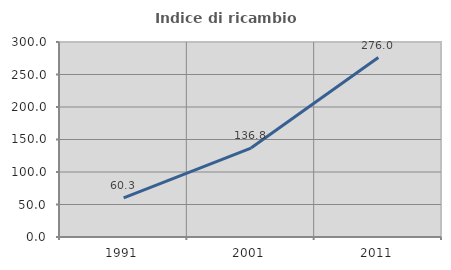
| Category | Indice di ricambio occupazionale  |
|---|---|
| 1991.0 | 60.274 |
| 2001.0 | 136.842 |
| 2011.0 | 276.033 |